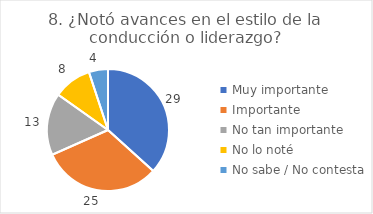
| Category | 8. ¿Notó avances en el estilo de la conducción o liderazgo? |
|---|---|
| Muy importante  | 0.367 |
| Importante  | 0.316 |
| No tan importante  | 0.165 |
| No lo noté  | 0.101 |
| No sabe / No contesta | 0.051 |